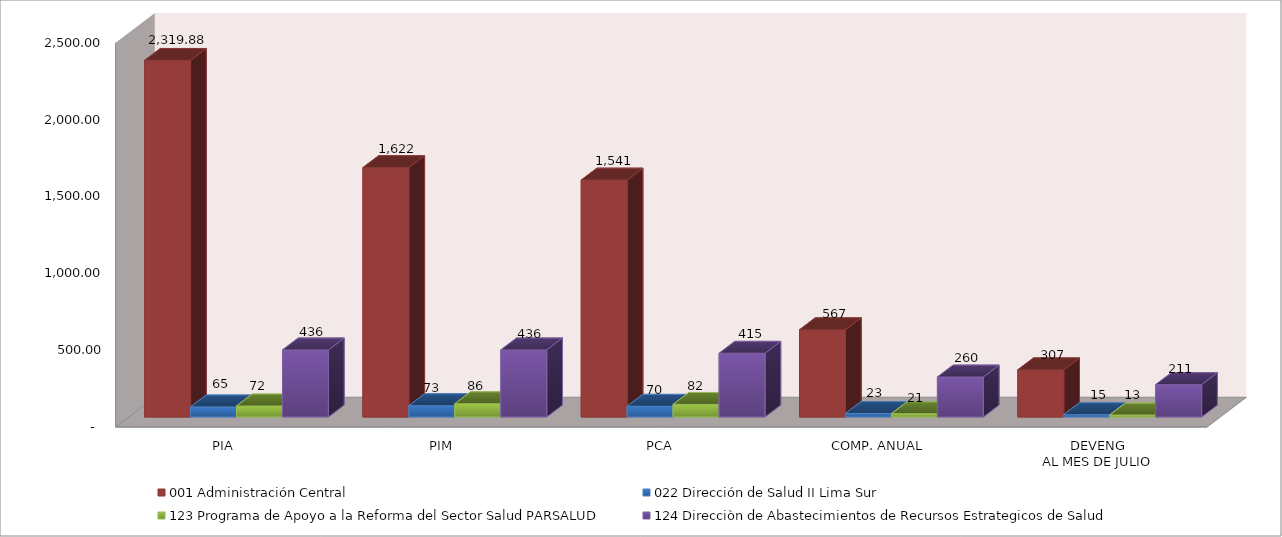
| Category | 001 Administración Central | 022 Dirección de Salud II Lima Sur | 123 Programa de Apoyo a la Reforma del Sector Salud PARSALUD | 124 Direcciòn de Abastecimientos de Recursos Estrategicos de Salud |
|---|---|---|---|---|
| PIA | 2319.877 | 65.372 | 71.532 | 436.35 |
| PIM | 1622.357 | 73.316 | 86.148 | 436.35 |
| PCA | 1541.239 | 69.65 | 81.84 | 414.532 |
| COMP. ANUAL | 567.287 | 22.989 | 21.113 | 260.039 |
| DEVENG
AL MES DE JULIO | 306.888 | 15.434 | 12.736 | 210.754 |